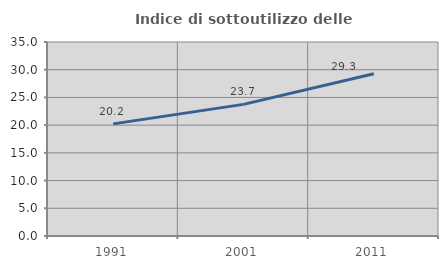
| Category | Indice di sottoutilizzo delle abitazioni  |
|---|---|
| 1991.0 | 20.23 |
| 2001.0 | 23.744 |
| 2011.0 | 29.271 |